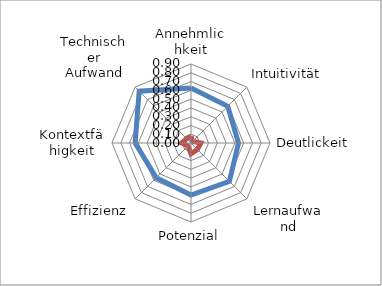
| Category | Series 0 | Series 1 |
|---|---|---|
| Annehmlichkeit | 0.626 | 0.078 |
| Intuitivität | 0.592 | 0.025 |
| Deutlickeit | 0.541 | 0.113 |
| Lernaufwand | 0.619 | 0.103 |
| Potenzial | 0.593 | 0.124 |
| Effizienz | 0.56 | 0.047 |
| Kontextfähigkeit | 0.636 | 0.106 |
| Technischer Aufwand | 0.835 | 0.07 |